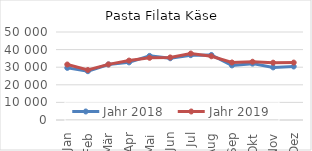
| Category | Jahr 2018 | Jahr 2019 |
|---|---|---|
| Jan | 29616.323 | 31522.704 |
| Feb | 27734.482 | 28402.523 |
| Mär | 31550.276 | 31598.1 |
| Apr | 32731.924 | 33763.107 |
| Mai | 36424.112 | 35342.635 |
| Jun | 35093.042 | 35542.568 |
| Jul | 36836.558 | 37761.727 |
| Aug | 36942.818 | 36222.548 |
| Sep | 31021.75 | 32689.304 |
| Okt | 32025.457 | 33100.822 |
| Nov | 29890.941 | 32565.209 |
| Dez | 30408.471 | 32624.959 |